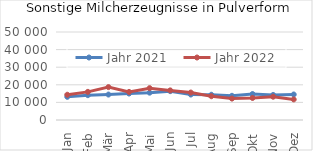
| Category | Jahr 2021 | Jahr 2022 |
|---|---|---|
| Jan | 13172.46 | 14340.749 |
| Feb | 14113.656 | 15987.535 |
| Mär | 14458.104 | 18692.616 |
| Apr | 15041.965 | 15957.632 |
| Mai | 15530.805 | 18091.914 |
| Jun | 16393.841 | 16825.55 |
| Jul | 14467.357 | 15603.202 |
| Aug | 14334.012 | 13508.81 |
| Sep | 13746.747 | 12173.54 |
| Okt | 14749.186 | 12520.206 |
| Nov | 14233.164 | 13228.63 |
| Dez | 14498.971 | 11697.177 |